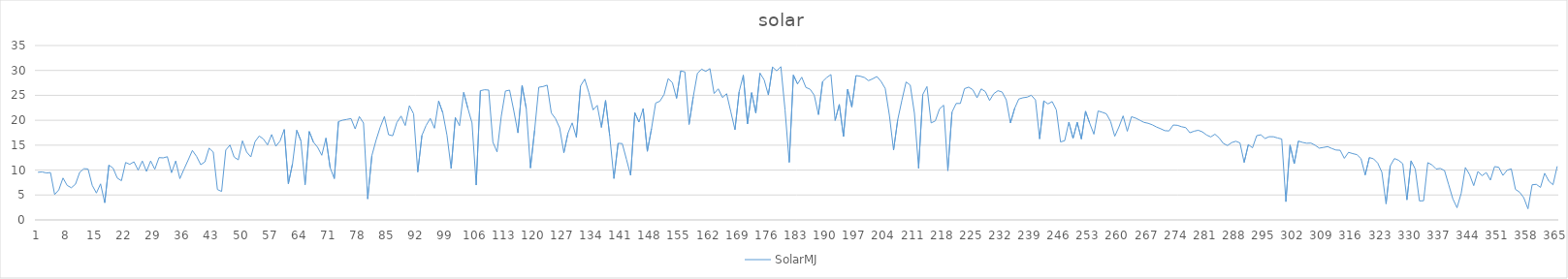
| Category | SolarMJ |
|---|---|
| 0 | 9.558 |
| 1 | 9.63 |
| 2 | 9.423 |
| 3 | 9.495 |
| 4 | 5.088 |
| 5 | 6.033 |
| 6 | 8.408 |
| 7 | 6.922 |
| 8 | 6.453 |
| 9 | 7.196 |
| 10 | 9.546 |
| 11 | 10.277 |
| 12 | 10.229 |
| 13 | 6.941 |
| 14 | 5.395 |
| 15 | 7.235 |
| 16 | 3.451 |
| 17 | 10.998 |
| 18 | 10.382 |
| 19 | 8.401 |
| 20 | 7.863 |
| 21 | 11.524 |
| 22 | 11.157 |
| 23 | 11.658 |
| 24 | 9.998 |
| 25 | 11.824 |
| 26 | 9.733 |
| 27 | 11.841 |
| 28 | 10.163 |
| 29 | 12.503 |
| 30 | 12.448 |
| 31 | 12.679 |
| 32 | 9.47 |
| 33 | 11.836 |
| 34 | 8.284 |
| 35 | 10.195 |
| 36 | 12.039 |
| 37 | 13.937 |
| 38 | 12.751 |
| 39 | 11.083 |
| 40 | 11.649 |
| 41 | 14.399 |
| 42 | 13.605 |
| 43 | 6.098 |
| 44 | 5.711 |
| 45 | 14.013 |
| 46 | 15.029 |
| 47 | 12.616 |
| 48 | 12.054 |
| 49 | 15.872 |
| 50 | 13.629 |
| 51 | 12.636 |
| 52 | 15.684 |
| 53 | 16.843 |
| 54 | 16.248 |
| 55 | 15.052 |
| 56 | 17.138 |
| 57 | 14.785 |
| 58 | 15.832 |
| 59 | 18.148 |
| 60 | 7.27 |
| 61 | 11.32 |
| 62 | 17.998 |
| 63 | 15.868 |
| 64 | 7.054 |
| 65 | 17.745 |
| 66 | 15.613 |
| 67 | 14.583 |
| 68 | 12.971 |
| 69 | 16.423 |
| 70 | 10.493 |
| 71 | 8.285 |
| 72 | 19.74 |
| 73 | 20.021 |
| 74 | 20.173 |
| 75 | 20.346 |
| 76 | 18.267 |
| 77 | 20.742 |
| 78 | 19.447 |
| 79 | 4.219 |
| 80 | 12.887 |
| 81 | 15.976 |
| 82 | 18.6 |
| 83 | 20.746 |
| 84 | 17.099 |
| 85 | 16.895 |
| 86 | 19.568 |
| 87 | 20.851 |
| 88 | 18.943 |
| 89 | 22.922 |
| 90 | 21.295 |
| 91 | 9.62 |
| 92 | 16.972 |
| 93 | 18.961 |
| 94 | 20.371 |
| 95 | 18.397 |
| 96 | 23.854 |
| 97 | 21.488 |
| 98 | 16.989 |
| 99 | 10.32 |
| 100 | 20.545 |
| 101 | 18.91 |
| 102 | 25.593 |
| 103 | 22.407 |
| 104 | 19.459 |
| 105 | 6.994 |
| 106 | 25.934 |
| 107 | 26.124 |
| 108 | 26.06 |
| 109 | 15.59 |
| 110 | 13.648 |
| 111 | 20.768 |
| 112 | 25.867 |
| 113 | 26.051 |
| 114 | 21.96 |
| 115 | 17.475 |
| 116 | 27.018 |
| 117 | 22.315 |
| 118 | 10.418 |
| 119 | 18.016 |
| 120 | 26.634 |
| 121 | 26.766 |
| 122 | 27.046 |
| 123 | 21.461 |
| 124 | 20.322 |
| 125 | 18.472 |
| 126 | 13.489 |
| 127 | 17.435 |
| 128 | 19.479 |
| 129 | 16.561 |
| 130 | 26.892 |
| 131 | 28.264 |
| 132 | 25.531 |
| 133 | 22.087 |
| 134 | 22.992 |
| 135 | 18.566 |
| 136 | 23.974 |
| 137 | 16.829 |
| 138 | 8.309 |
| 139 | 15.376 |
| 140 | 15.319 |
| 141 | 12.158 |
| 142 | 8.952 |
| 143 | 21.516 |
| 144 | 19.634 |
| 145 | 22.353 |
| 146 | 13.772 |
| 147 | 18.298 |
| 148 | 23.457 |
| 149 | 23.821 |
| 150 | 25.146 |
| 151 | 28.357 |
| 152 | 27.564 |
| 153 | 24.405 |
| 154 | 29.907 |
| 155 | 29.701 |
| 156 | 19.159 |
| 157 | 24.673 |
| 158 | 29.408 |
| 159 | 30.271 |
| 160 | 29.808 |
| 161 | 30.364 |
| 162 | 25.37 |
| 163 | 26.304 |
| 164 | 24.561 |
| 165 | 25.329 |
| 166 | 21.725 |
| 167 | 18.106 |
| 168 | 25.722 |
| 169 | 29.057 |
| 170 | 19.275 |
| 171 | 25.537 |
| 172 | 21.452 |
| 173 | 29.452 |
| 174 | 28.089 |
| 175 | 25.075 |
| 176 | 30.676 |
| 177 | 29.917 |
| 178 | 30.744 |
| 179 | 22.049 |
| 180 | 11.553 |
| 181 | 29.062 |
| 182 | 27.291 |
| 183 | 28.645 |
| 184 | 26.59 |
| 185 | 26.234 |
| 186 | 25.011 |
| 187 | 21.133 |
| 188 | 27.778 |
| 189 | 28.589 |
| 190 | 29.176 |
| 191 | 19.955 |
| 192 | 23.173 |
| 193 | 16.75 |
| 194 | 26.211 |
| 195 | 22.662 |
| 196 | 28.971 |
| 197 | 28.841 |
| 198 | 28.588 |
| 199 | 27.954 |
| 200 | 28.323 |
| 201 | 28.783 |
| 202 | 27.799 |
| 203 | 26.377 |
| 204 | 20.986 |
| 205 | 14.007 |
| 206 | 20.124 |
| 207 | 24.033 |
| 208 | 27.683 |
| 209 | 27.047 |
| 210 | 21.4 |
| 211 | 10.363 |
| 212 | 25.172 |
| 213 | 26.764 |
| 214 | 19.468 |
| 215 | 19.875 |
| 216 | 22.272 |
| 217 | 23.021 |
| 218 | 9.87 |
| 219 | 21.64 |
| 220 | 23.374 |
| 221 | 23.37 |
| 222 | 26.344 |
| 223 | 26.653 |
| 224 | 26.109 |
| 225 | 24.513 |
| 226 | 26.293 |
| 227 | 25.742 |
| 228 | 23.961 |
| 229 | 25.33 |
| 230 | 25.931 |
| 231 | 25.676 |
| 232 | 24.092 |
| 233 | 19.456 |
| 234 | 22.359 |
| 235 | 24.257 |
| 236 | 24.516 |
| 237 | 24.634 |
| 238 | 25.018 |
| 239 | 24.072 |
| 240 | 16.262 |
| 241 | 23.884 |
| 242 | 23.286 |
| 243 | 23.749 |
| 244 | 22.081 |
| 245 | 15.652 |
| 246 | 15.898 |
| 247 | 19.615 |
| 248 | 16.371 |
| 249 | 19.576 |
| 250 | 16.244 |
| 251 | 21.809 |
| 252 | 19.394 |
| 253 | 17.197 |
| 254 | 21.862 |
| 255 | 21.605 |
| 256 | 21.29 |
| 257 | 19.749 |
| 258 | 16.788 |
| 259 | 18.662 |
| 260 | 20.881 |
| 261 | 17.792 |
| 262 | 20.712 |
| 263 | 20.432 |
| 264 | 20.006 |
| 265 | 19.576 |
| 266 | 19.393 |
| 267 | 19.082 |
| 268 | 18.647 |
| 269 | 18.298 |
| 270 | 17.911 |
| 271 | 17.859 |
| 272 | 19.046 |
| 273 | 18.991 |
| 274 | 18.703 |
| 275 | 18.525 |
| 276 | 17.494 |
| 277 | 17.801 |
| 278 | 17.996 |
| 279 | 17.666 |
| 280 | 17.04 |
| 281 | 16.658 |
| 282 | 17.2 |
| 283 | 16.467 |
| 284 | 15.353 |
| 285 | 14.928 |
| 286 | 15.512 |
| 287 | 15.789 |
| 288 | 15.449 |
| 289 | 11.533 |
| 290 | 15.123 |
| 291 | 14.471 |
| 292 | 16.904 |
| 293 | 17.086 |
| 294 | 16.348 |
| 295 | 16.703 |
| 296 | 16.692 |
| 297 | 16.446 |
| 298 | 16.24 |
| 299 | 3.666 |
| 300 | 15.026 |
| 301 | 11.295 |
| 302 | 15.828 |
| 303 | 15.55 |
| 304 | 15.388 |
| 305 | 15.421 |
| 306 | 14.99 |
| 307 | 14.405 |
| 308 | 14.545 |
| 309 | 14.714 |
| 310 | 14.335 |
| 311 | 14.029 |
| 312 | 13.977 |
| 313 | 12.354 |
| 314 | 13.567 |
| 315 | 13.313 |
| 316 | 13.104 |
| 317 | 12.292 |
| 318 | 9.022 |
| 319 | 12.515 |
| 320 | 12.26 |
| 321 | 11.404 |
| 322 | 9.56 |
| 323 | 3.229 |
| 324 | 10.831 |
| 325 | 12.315 |
| 326 | 11.972 |
| 327 | 11.289 |
| 328 | 4.03 |
| 329 | 11.873 |
| 330 | 10.184 |
| 331 | 3.807 |
| 332 | 3.849 |
| 333 | 11.493 |
| 334 | 11.05 |
| 335 | 10.215 |
| 336 | 10.335 |
| 337 | 9.915 |
| 338 | 7.068 |
| 339 | 4.235 |
| 340 | 2.444 |
| 341 | 5.337 |
| 342 | 10.523 |
| 343 | 9.114 |
| 344 | 6.88 |
| 345 | 9.706 |
| 346 | 8.869 |
| 347 | 9.505 |
| 348 | 7.994 |
| 349 | 10.701 |
| 350 | 10.565 |
| 351 | 8.936 |
| 352 | 9.971 |
| 353 | 10.252 |
| 354 | 6.134 |
| 355 | 5.563 |
| 356 | 4.442 |
| 357 | 2.233 |
| 358 | 7.054 |
| 359 | 7.137 |
| 360 | 6.527 |
| 361 | 9.361 |
| 362 | 7.789 |
| 363 | 7.058 |
| 364 | 10.756 |